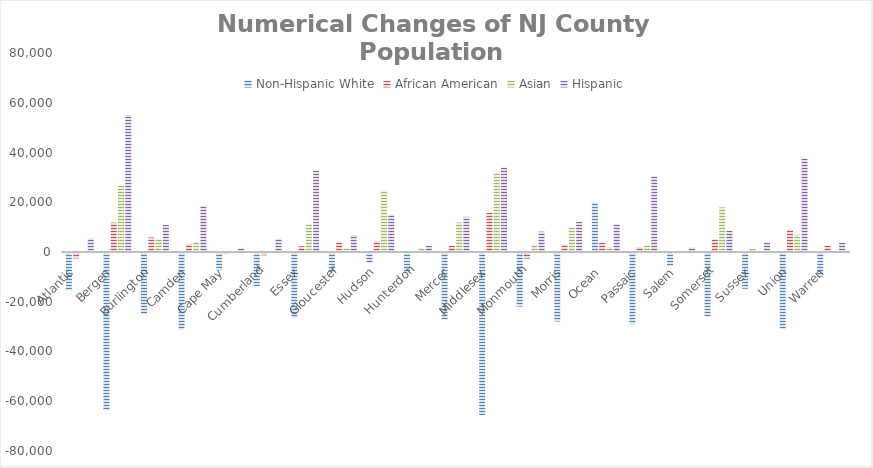
| Category | Non-Hispanic White | African American | Asian | Hispanic |
|---|---|---|---|---|
| Atlantic  | -15087 | -2156 | -81 | 5475 |
| Bergen  | -63279 | 11815 | 26710 | 55111 |
| Burlington  | -24478 | 5842 | 5190 | 10926 |
| Camden  | -30887 | 3257 | 3993 | 18492 |
| Cape May  | -6927 | -446 | 50 | 1539 |
| Cumberland | -13353 | -946 | 38 | 5343 |
| Essex  | -26131 | 2314 | 11354 | 32741 |
| Gloucester | -7649 | 3909 | 1546 | 6840 |
| Hudson  | -4005 | 4447 | 24712 | 15062 |
| Hunterdon | -8052 | 200 | 1440 | 2469 |
| Mercer  | -26812 | 2617 | 11863 | 14141 |
| Middlesex  | -65166 | 15829 | 31678 | 33970 |
| Monmouth | -21542 | -2263 | 3025 | 8187 |
| Morris  | -27531 | 3093 | 10175 | 12176 |
| Ocean  | 19928 | 3664 | 2015 | 11151 |
| Passaic  | -28595 | 1989 | 2729 | 30459 |
| Salem  | -5355 | -180 | 114 | 1850 |
| Somerset | -25567 | 5162 | 17927 | 8483 |
| Sussex  | -14351 | 1068 | 289 | 3784 |
| Union  | -30625 | 8956 | 6952 | 37577 |
| Warren  | -9534 | 2561 | 355 | 3736 |